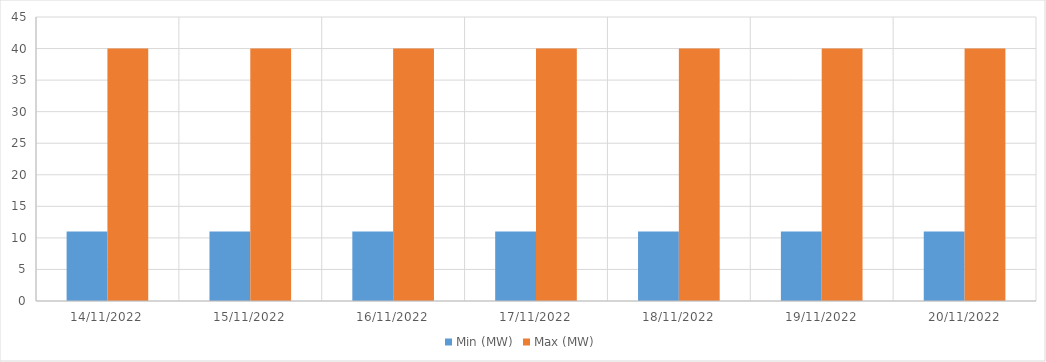
| Category | Min (MW) | Max (MW) |
|---|---|---|
| 14/11/2022 | 11 | 40 |
| 15/11/2022 | 11 | 40 |
| 16/11/2022 | 11 | 40 |
| 17/11/2022 | 11 | 40 |
| 18/11/2022 | 11 | 40 |
| 19/11/2022 | 11 | 40 |
| 20/11/2022 | 11 | 40 |